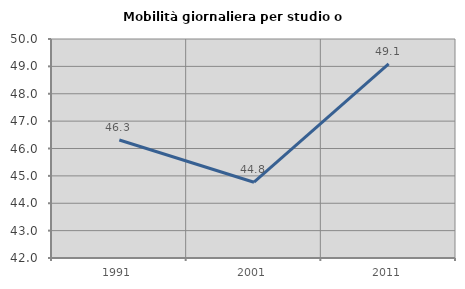
| Category | Mobilità giornaliera per studio o lavoro |
|---|---|
| 1991.0 | 46.31 |
| 2001.0 | 44.768 |
| 2011.0 | 49.089 |